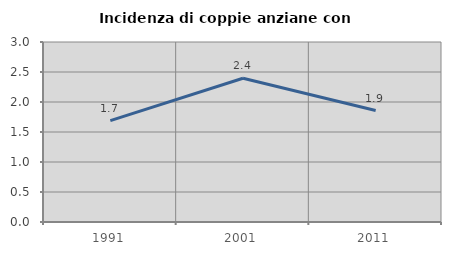
| Category | Incidenza di coppie anziane con figli |
|---|---|
| 1991.0 | 1.69 |
| 2001.0 | 2.395 |
| 2011.0 | 1.858 |